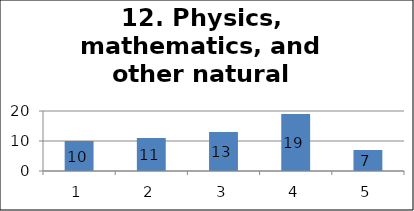
| Category | Series 1 |
|---|---|
| 0 | 10 |
| 1 | 11 |
| 2 | 13 |
| 3 | 19 |
| 4 | 7 |